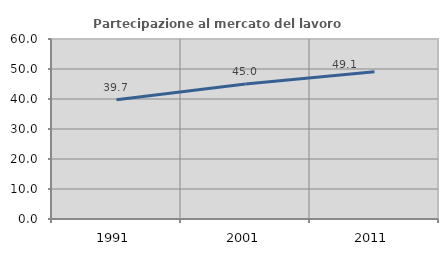
| Category | Partecipazione al mercato del lavoro  femminile |
|---|---|
| 1991.0 | 39.73 |
| 2001.0 | 45.029 |
| 2011.0 | 49.094 |